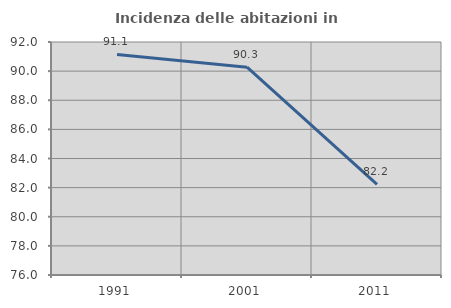
| Category | Incidenza delle abitazioni in proprietà  |
|---|---|
| 1991.0 | 91.145 |
| 2001.0 | 90.271 |
| 2011.0 | 82.218 |